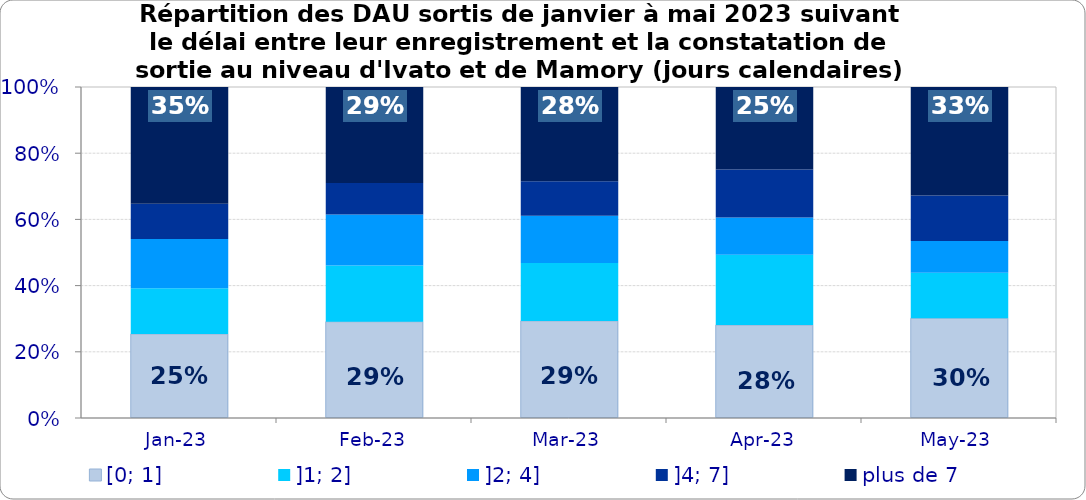
| Category | [0; 1] | ]1; 2] | ]2; 4] | ]4; 7] | plus de 7 |
|---|---|---|---|---|---|
| 2023-01-01 | 0.254 | 0.138 | 0.149 | 0.106 | 0.353 |
| 2023-02-01 | 0.291 | 0.17 | 0.155 | 0.095 | 0.29 |
| 2023-03-01 | 0.293 | 0.175 | 0.143 | 0.104 | 0.284 |
| 2023-04-01 | 0.281 | 0.213 | 0.113 | 0.145 | 0.249 |
| 2023-05-01 | 0.301 | 0.138 | 0.096 | 0.137 | 0.328 |